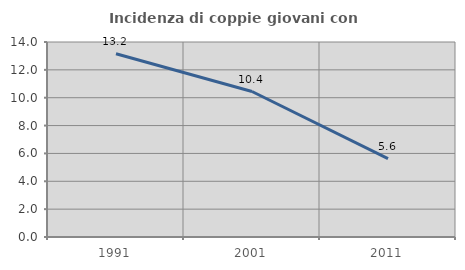
| Category | Incidenza di coppie giovani con figli |
|---|---|
| 1991.0 | 13.158 |
| 2001.0 | 10.445 |
| 2011.0 | 5.626 |